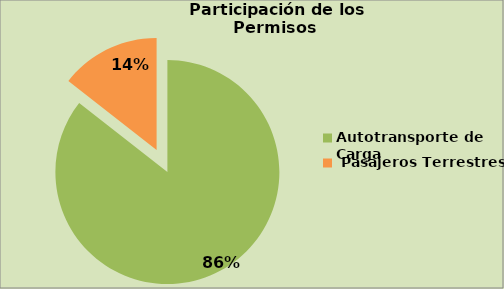
| Category | Series 0 |
|---|---|
| Autotransporte de Carga  | 85.559 |
|  Pasajeros Terrestres | 14.441 |